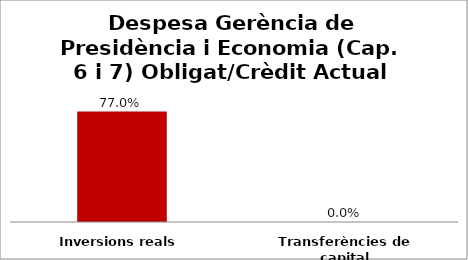
| Category | Series 0 |
|---|---|
| Inversions reals | 0.77 |
| Transferències de capital | 0 |